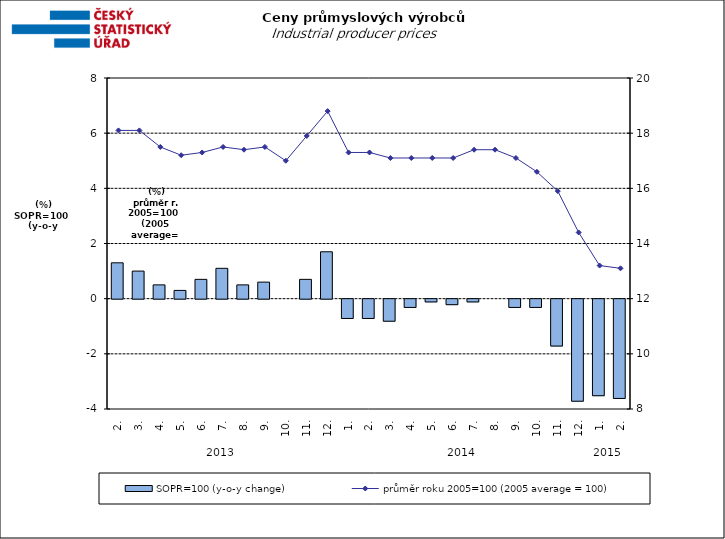
| Category | SOPR=100 (y-o-y change)   |
|---|---|
| 0 | 1.3 |
| 1 | 1 |
| 2 | 0.5 |
| 3 | 0.3 |
| 4 | 0.7 |
| 5 | 1.1 |
| 6 | 0.5 |
| 7 | 0.6 |
| 8 | 0 |
| 9 | 0.7 |
| 10 | 1.7 |
| 11 | -0.7 |
| 12 | -0.7 |
| 13 | -0.8 |
| 14 | -0.3 |
| 15 | -0.1 |
| 16 | -0.2 |
| 17 | -0.1 |
| 18 | 0 |
| 19 | -0.3 |
| 20 | -0.3 |
| 21 | -1.7 |
| 22 | -3.7 |
| 23 | -3.5 |
| 24 | -3.6 |